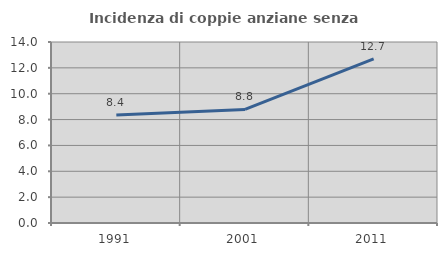
| Category | Incidenza di coppie anziane senza figli  |
|---|---|
| 1991.0 | 8.351 |
| 2001.0 | 8.782 |
| 2011.0 | 12.692 |